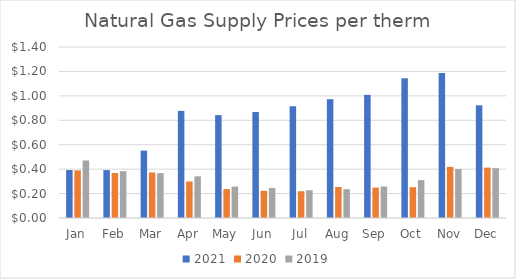
| Category | 2021 | 2020 | 2019 |
|---|---|---|---|
| Jan | 0.393 | 0.39 | 0.471 |
| Feb | 0.392 | 0.368 | 0.384 |
| Mar | 0.552 | 0.372 | 0.368 |
| Apr | 0.877 | 0.299 | 0.341 |
| May | 0.842 | 0.237 | 0.257 |
| Jun | 0.868 | 0.223 | 0.245 |
| Jul | 0.915 | 0.219 | 0.228 |
| Aug | 0.973 | 0.254 | 0.236 |
| Sep | 1.008 | 0.249 | 0.258 |
| Oct | 1.143 | 0.252 | 0.31 |
| Nov | 1.187 | 0.419 | 0.401 |
| Dec | 0.922 | 0.412 | 0.408 |